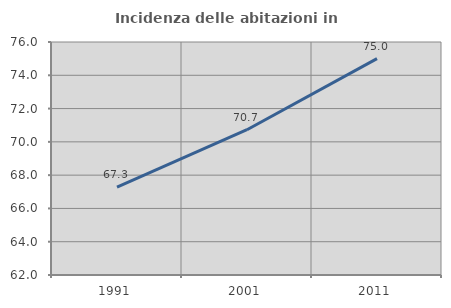
| Category | Incidenza delle abitazioni in proprietà  |
|---|---|
| 1991.0 | 67.285 |
| 2001.0 | 70.729 |
| 2011.0 | 75 |